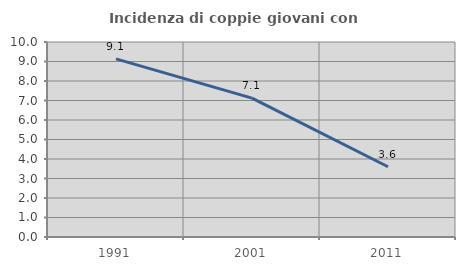
| Category | Incidenza di coppie giovani con figli |
|---|---|
| 1991.0 | 9.137 |
| 2001.0 | 7.121 |
| 2011.0 | 3.604 |